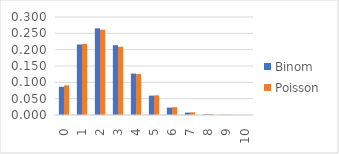
| Category | Binom | Poisson |
|---|---|---|
| 0.0 | 0.086 | 0.091 |
| 1.0 | 0.216 | 0.218 |
| 2.0 | 0.265 | 0.261 |
| 3.0 | 0.214 | 0.209 |
| 4.0 | 0.127 | 0.125 |
| 5.0 | 0.059 | 0.06 |
| 6.0 | 0.023 | 0.024 |
| 7.0 | 0.007 | 0.008 |
| 8.0 | 0.002 | 0.002 |
| 9.0 | 0 | 0.001 |
| 10.0 | 0 | 0 |